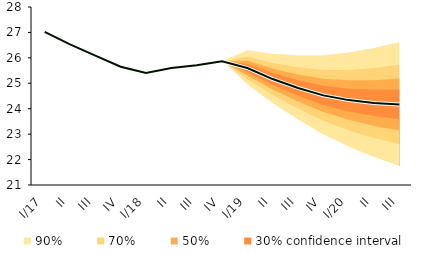
| Category | linka | Centerline |
|---|---|---|
| 0 | 27.02 | 27.02 |
| 1 | 26.532 | 26.532 |
| 2 | 26.084 | 26.084 |
| 3 | 25.651 | 25.651 |
| 4 | 25.402 | 25.402 |
| 5 | 25.599 | 25.599 |
| 6 | 25.711 | 25.711 |
| 7 | 25.862 | 25.862 |
| 8 | 25.6 | 25.6 |
| 9 | 25.166 | 25.166 |
| 10 | 24.817 | 24.817 |
| 11 | 24.524 | 24.524 |
| 12 | 24.338 | 24.338 |
| 13 | 24.226 | 24.226 |
| 14 | 24.167 | 24.167 |